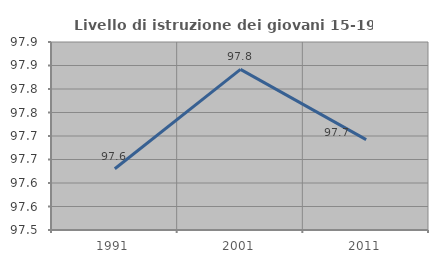
| Category | Livello di istruzione dei giovani 15-19 anni |
|---|---|
| 1991.0 | 97.63 |
| 2001.0 | 97.842 |
| 2011.0 | 97.692 |